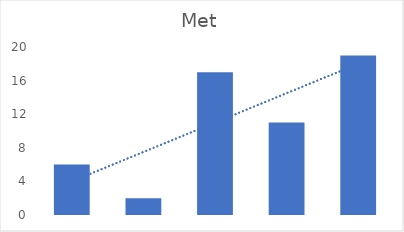
| Category | Met |
|---|---|
| East | 6 |
| West | 2 |
| South | 17 |
| North | 11 |
| Central | 19 |